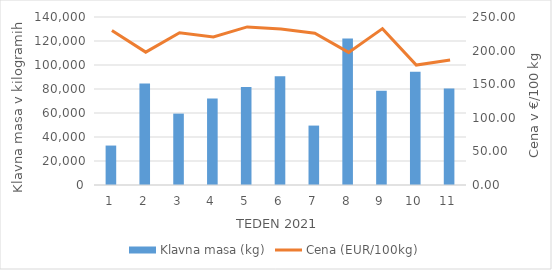
| Category | Klavna masa (kg) |
|---|---|
| 1.0 | 32871 |
| 2.0 | 84639 |
| 3.0 | 59476 |
| 4.0 | 72013 |
| 5.0 | 81759 |
| 6.0 | 90669 |
| 7.0 | 49517 |
| 8.0 | 122111 |
| 9.0 | 78545 |
| 10.0 | 94384 |
| 11.0 | 80405 |